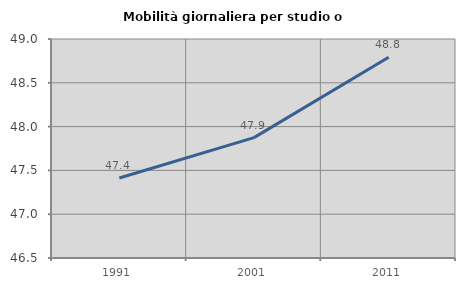
| Category | Mobilità giornaliera per studio o lavoro |
|---|---|
| 1991.0 | 47.414 |
| 2001.0 | 47.874 |
| 2011.0 | 48.792 |